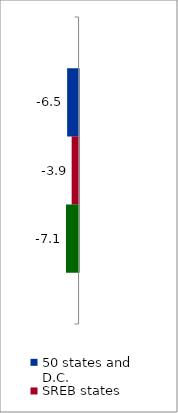
| Category | 50 states and D.C. | SREB states | State |
|---|---|---|---|
| 2010 to 2015 | -6.453 | -3.906 | -7.097 |